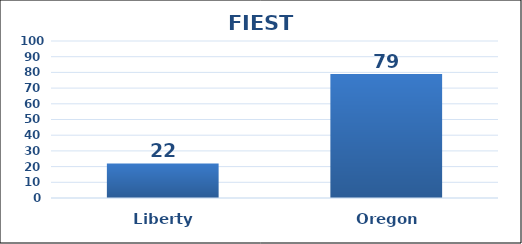
| Category | Series 0 |
|---|---|
| Liberty | 22 |
| Oregon | 79 |